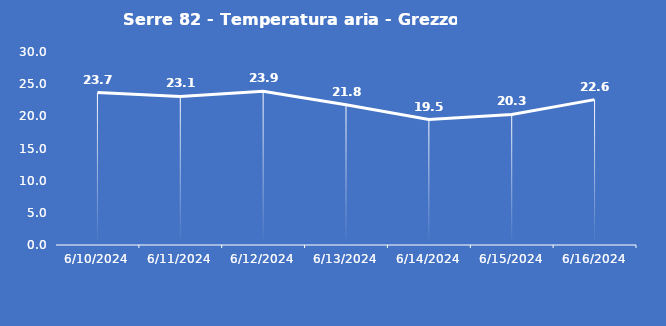
| Category | Serre 82 - Temperatura aria - Grezzo (°C) |
|---|---|
| 6/10/24 | 23.7 |
| 6/11/24 | 23.1 |
| 6/12/24 | 23.9 |
| 6/13/24 | 21.8 |
| 6/14/24 | 19.5 |
| 6/15/24 | 20.3 |
| 6/16/24 | 22.6 |